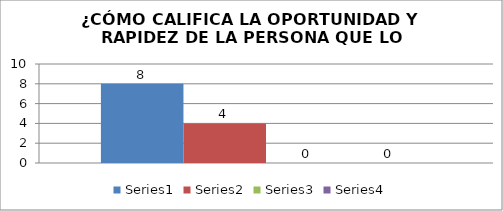
| Category | Series 0 | Series 1 | Series 2 | Series 3 |
|---|---|---|---|---|
| 0 | 8 | 4 | 0 | 0 |